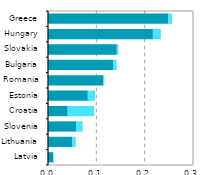
| Category |  ICT services  |   ICT manufacturing |
|---|---|---|
| Latvia | 0.01 | 0.001 |
| Lithuania | 0.051 | 0.007 |
| Slovenia | 0.058 | 0.014 |
| Croatia | 0.041 | 0.055 |
| Estonia | 0.082 | 0.015 |
| Romania | 0.114 | 0.002 |
| Bulgaria | 0.135 | 0.007 |
| Slovakia | 0.142 | 0.003 |
| Hungary | 0.217 | 0.016 |
| Greece | 0.249 | 0.008 |